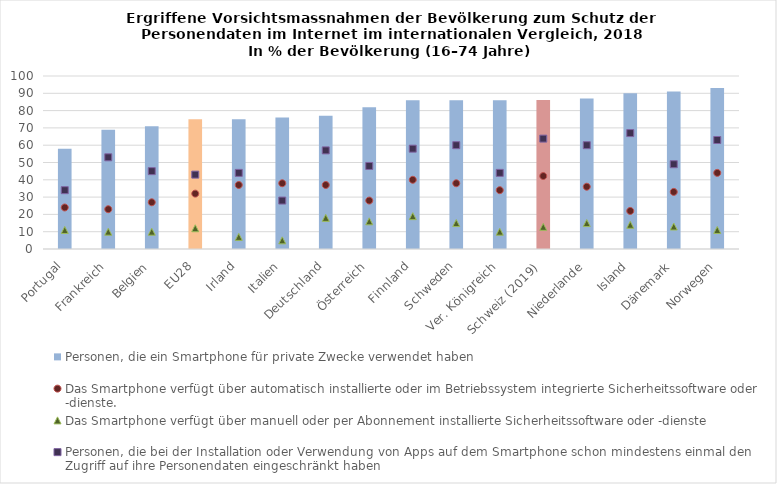
| Category | Personen, die ein Smartphone für private Zwecke verwendet haben |
|---|---|
| Portugal | 58 |
| Frankreich | 69 |
| Belgien | 71 |
| EU28 | 75 |
| Irland | 75 |
| Italien | 76 |
| Deutschland | 77 |
| Österreich | 82 |
| Finnland | 86 |
| Schweden | 86 |
| Ver. Königreich | 86 |
| Schweiz (2019)  | 86.181 |
| Niederlande | 87 |
| Island | 90 |
| Dänemark | 91 |
| Norwegen | 93 |